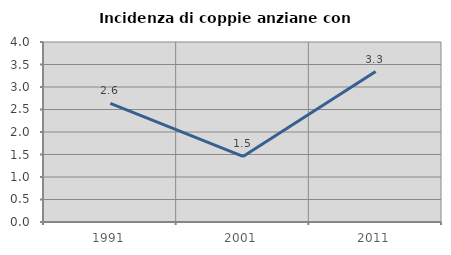
| Category | Incidenza di coppie anziane con figli |
|---|---|
| 1991.0 | 2.637 |
| 2001.0 | 1.457 |
| 2011.0 | 3.343 |